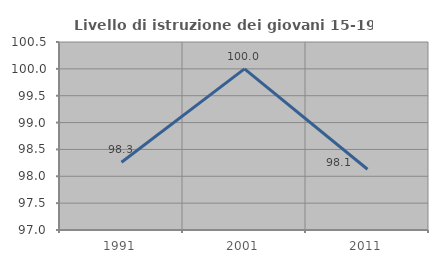
| Category | Livello di istruzione dei giovani 15-19 anni |
|---|---|
| 1991.0 | 98.261 |
| 2001.0 | 100 |
| 2011.0 | 98.131 |